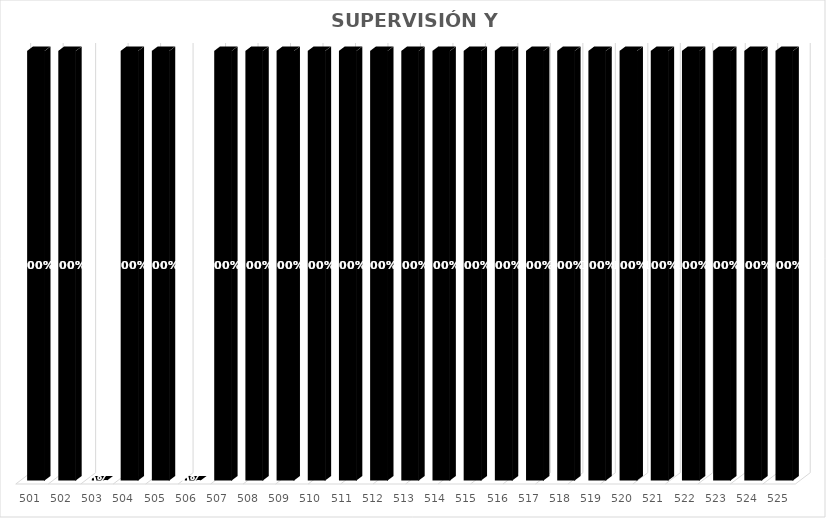
| Category | % Avance |
|---|---|
| 501.0 | 1 |
| 502.0 | 1 |
| 503.0 | 0 |
| 504.0 | 1 |
| 505.0 | 1 |
| 506.0 | 0 |
| 507.0 | 1 |
| 508.0 | 1 |
| 509.0 | 1 |
| 510.0 | 1 |
| 511.0 | 1 |
| 512.0 | 1 |
| 513.0 | 1 |
| 514.0 | 1 |
| 515.0 | 1 |
| 516.0 | 1 |
| 517.0 | 1 |
| 518.0 | 1 |
| 519.0 | 1 |
| 520.0 | 1 |
| 521.0 | 1 |
| 522.0 | 1 |
| 523.0 | 1 |
| 524.0 | 1 |
| 525.0 | 1 |